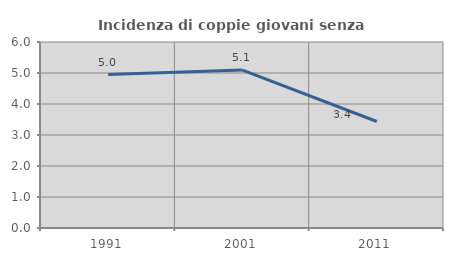
| Category | Incidenza di coppie giovani senza figli |
|---|---|
| 1991.0 | 4.951 |
| 2001.0 | 5.093 |
| 2011.0 | 3.436 |